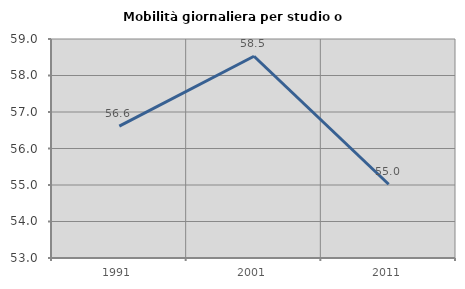
| Category | Mobilità giornaliera per studio o lavoro |
|---|---|
| 1991.0 | 56.614 |
| 2001.0 | 58.527 |
| 2011.0 | 55.021 |